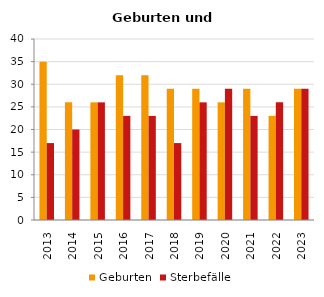
| Category | Geburten | Sterbefälle |
|---|---|---|
| 2013.0 | 35 | 17 |
| 2014.0 | 26 | 20 |
| 2015.0 | 26 | 26 |
| 2016.0 | 32 | 23 |
| 2017.0 | 32 | 23 |
| 2018.0 | 29 | 17 |
| 2019.0 | 29 | 26 |
| 2020.0 | 26 | 29 |
| 2021.0 | 29 | 23 |
| 2022.0 | 23 | 26 |
| 2023.0 | 29 | 29 |